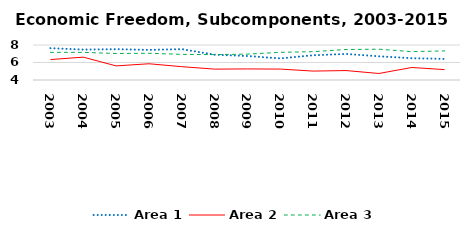
| Category | Area 1 | Area 2 | Area 3 |
|---|---|---|---|
| 2003.0 | 7.637 | 6.336 | 7.159 |
| 2004.0 | 7.477 | 6.612 | 7.16 |
| 2005.0 | 7.524 | 5.611 | 7.028 |
| 2006.0 | 7.443 | 5.856 | 7.055 |
| 2007.0 | 7.528 | 5.522 | 6.928 |
| 2008.0 | 6.893 | 5.244 | 6.9 |
| 2009.0 | 6.742 | 5.266 | 6.959 |
| 2010.0 | 6.465 | 5.247 | 7.162 |
| 2011.0 | 6.827 | 5.019 | 7.239 |
| 2012.0 | 6.978 | 5.079 | 7.485 |
| 2013.0 | 6.71 | 4.744 | 7.52 |
| 2014.0 | 6.491 | 5.43 | 7.24 |
| 2015.0 | 6.411 | 5.187 | 7.328 |